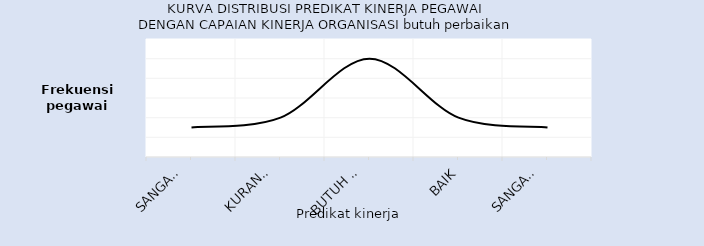
| Category | Series 0 |
|---|---|
| Sangat 
Kurang | 3 |
| Kurang/
Misconduct | 4 |
| Butuh 
Perbaikan | 10 |
| Baik | 4 |
| Sangat 
Baik | 3 |